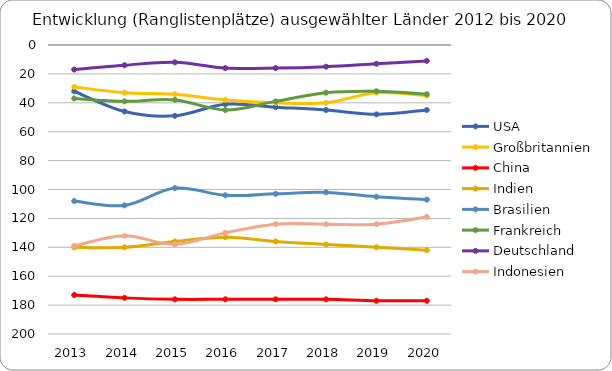
| Category | USA | Großbritannien | China | Indien | Brasilien | Frankreich | Deutschland | Indonesien |
|---|---|---|---|---|---|---|---|---|
| 2013.0 | 32 | 29 | 173 | 140 | 108 | 37 | 17 | 139 |
| 2014.0 | 46 | 33 | 175 | 140 | 111 | 39 | 14 | 132 |
| 2015.0 | 49 | 34 | 176 | 136 | 99 | 38 | 12 | 138 |
| 2016.0 | 41 | 38 | 176 | 133 | 104 | 45 | 16 | 130 |
| 2017.0 | 43 | 40 | 176 | 136 | 103 | 39 | 16 | 124 |
| 2018.0 | 45 | 40 | 176 | 138 | 102 | 33 | 15 | 124 |
| 2019.0 | 48 | 33 | 177 | 140 | 105 | 32 | 13 | 124 |
| 2020.0 | 45 | 35 | 177 | 142 | 107 | 34 | 11 | 119 |